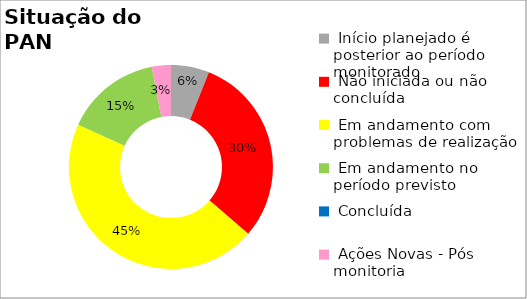
| Category | Series 0 |
|---|---|
|  Início planejado é posterior ao período monitorado | 0.061 |
|  Não iniciada ou não concluída | 0.303 |
|  Em andamento com problemas de realização | 0.455 |
|  Em andamento no período previsto  | 0.152 |
|  Concluída | 0 |
|  Ações Novas - Pós monitoria | 0.03 |